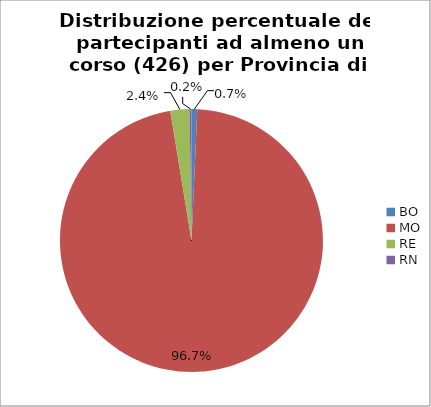
| Category | Nr. Tesserati |
|---|---|
| BO | 3 |
| MO | 412 |
| RE | 10 |
| RN | 1 |